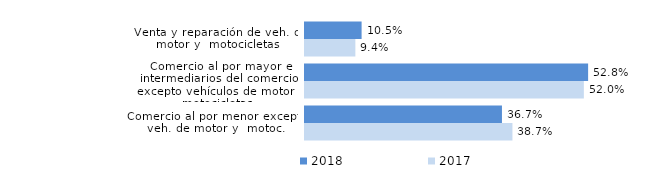
| Category | 2018 | 2017 |
|---|---|---|
| Venta y reparación de veh. de motor y  motocicletas | 0.105 | 0.094 |
| Comercio al por mayor e intermediarios del comercio, excepto vehículos de motor y motocicletas | 0.528 | 0.52 |
| Comercio al por menor excepto veh. de motor y  motoc. | 0.367 | 0.387 |